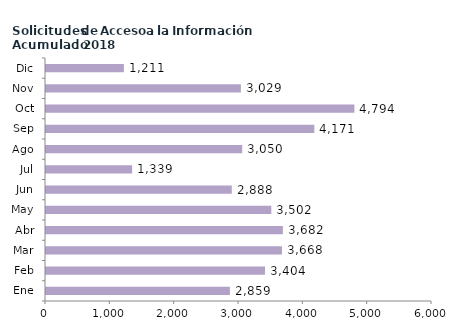
| Category | Series 0 |
|---|---|
| Ene | 2859 |
| Feb | 3404 |
| Mar | 3668 |
| Abr | 3682 |
| May | 3502 |
| Jun | 2888 |
| Jul | 1339 |
| Ago | 3050 |
| Sep | 4171 |
| Oct | 4794 |
| Nov | 3029 |
| Dic | 1211 |